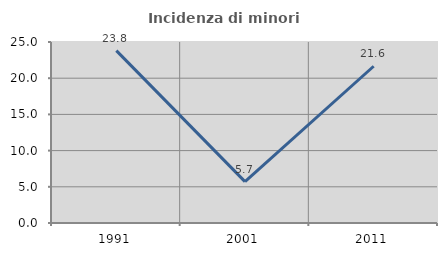
| Category | Incidenza di minori stranieri |
|---|---|
| 1991.0 | 23.81 |
| 2001.0 | 5.714 |
| 2011.0 | 21.649 |